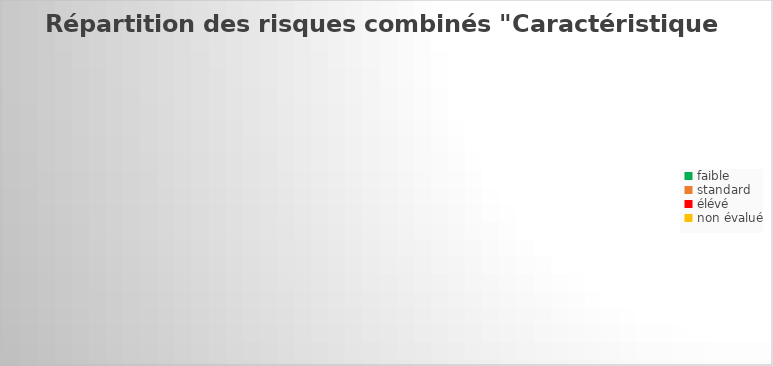
| Category | Series 0 |
|---|---|
| faible | 0 |
| standard | 0 |
| élévé | 0 |
| non évalué | 0 |